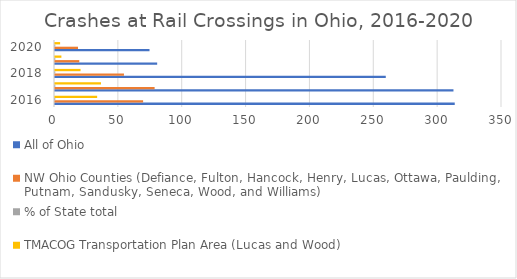
| Category | All of Ohio | NW Ohio Counties (Defiance, Fulton, Hancock, Henry, Lucas, Ottawa, Paulding, Putnam, Sandusky, Seneca, Wood, and Williams) | % of State total | TMACOG Transportation Plan Area (Lucas and Wood) |
|---|---|---|---|---|
| 2016.0 | 313 | 69 | 0.22 | 33 |
| 2017.0 | 312 | 78 | 0.25 | 36 |
| 2018.0 | 259 | 54 | 0.208 | 20 |
| 2019.0 | 80 | 19 | 0.238 | 5 |
| 2020.0 | 74 | 18 | 0.243 | 4 |